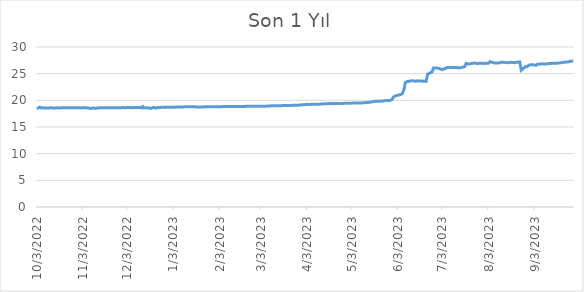
| Category | Series 0 |
|---|---|
| 10/3/22 | 18.486 |
| 10/3/22 | 18.522 |
| 10/4/22 | 18.556 |
| 10/4/22 | 18.536 |
| 10/5/22 | 18.738 |
| 10/5/22 | 18.557 |
| 10/6/22 | 18.568 |
| 10/6/22 | 18.58 |
| 10/7/22 | 18.592 |
| 10/10/22 | 18.566 |
| 10/10/22 | 18.549 |
| 10/11/22 | 18.578 |
| 10/11/22 | 18.58 |
| 10/12/22 | 18.601 |
| 10/12/22 | 18.505 |
| 10/13/22 | 18.597 |
| 10/13/22 | 18.529 |
| 10/14/22 | 18.568 |
| 10/17/22 | 18.591 |
| 10/17/22 | 18.607 |
| 10/18/22 | 18.568 |
| 10/18/22 | 18.582 |
| 10/19/22 | 18.585 |
| 10/19/22 | 18.574 |
| 10/20/22 | 18.595 |
| 10/20/22 | 18.579 |
| 10/21/22 | 18.594 |
| 10/24/22 | 18.594 |
| 10/24/22 | 18.549 |
| 10/25/22 | 18.618 |
| 10/25/22 | 18.59 |
| 10/26/22 | 18.616 |
| 10/26/22 | 18.604 |
| 10/27/22 | 18.602 |
| 10/27/22 | 18.586 |
| 10/28/22 | 18.6 |
| 10/31/22 | 18.612 |
| 10/31/22 | 18.601 |
| 11/1/22 | 18.609 |
| 11/1/22 | 18.555 |
| 11/2/22 | 18.572 |
| 11/2/22 | 18.584 |
| 11/3/22 | 18.623 |
| 11/3/22 | 18.593 |
| 11/4/22 | 18.617 |
| 11/7/22 | 18.568 |
| 11/7/22 | 18.437 |
| 11/8/22 | 18.451 |
| 11/8/22 | 18.519 |
| 11/9/22 | 18.534 |
| 11/9/22 | 18.568 |
| 11/10/22 | 18.583 |
| 11/10/22 | 18.459 |
| 11/11/22 | 18.491 |
| 11/14/22 | 18.592 |
| 11/14/22 | 18.585 |
| 11/15/22 | 18.592 |
| 11/15/22 | 18.588 |
| 11/16/22 | 18.619 |
| 11/16/22 | 18.592 |
| 11/17/22 | 18.62 |
| 11/17/22 | 18.544 |
| 11/18/22 | 18.586 |
| 11/21/22 | 18.627 |
| 11/21/22 | 18.607 |
| 11/22/22 | 18.615 |
| 11/22/22 | 18.608 |
| 11/23/22 | 18.621 |
| 11/23/22 | 18.606 |
| 11/24/22 | 18.618 |
| 11/24/22 | 18.58 |
| 11/25/22 | 18.609 |
| 11/28/22 | 18.602 |
| 11/28/22 | 18.6 |
| 11/29/22 | 18.618 |
| 11/29/22 | 18.657 |
| 11/30/22 | 18.656 |
| 11/30/22 | 18.61 |
| 12/1/22 | 18.596 |
| 12/1/22 | 18.628 |
| 12/2/22 | 18.634 |
| 12/5/22 | 18.65 |
| 12/5/22 | 18.635 |
| 12/6/22 | 18.627 |
| 12/6/22 | 18.617 |
| 12/7/22 | 18.629 |
| 12/7/22 | 18.62 |
| 12/8/22 | 18.647 |
| 12/8/22 | 18.611 |
| 12/9/22 | 18.641 |
| 12/12/22 | 18.65 |
| 12/12/22 | 18.624 |
| 12/13/22 | 18.792 |
| 12/13/22 | 18.597 |
| 12/14/22 | 18.62 |
| 12/14/22 | 18.595 |
| 12/15/22 | 18.63 |
| 12/15/22 | 18.626 |
| 12/16/22 | 18.627 |
| 12/19/22 | 18.478 |
| 12/19/22 | 18.635 |
| 12/20/22 | 18.656 |
| 12/20/22 | 18.648 |
| 12/21/22 | 18.65 |
| 12/21/22 | 18.622 |
| 12/22/22 | 18.505 |
| 12/22/22 | 18.642 |
| 12/23/22 | 18.644 |
| 12/26/22 | 18.683 |
| 12/26/22 | 18.66 |
| 12/27/22 | 18.695 |
| 12/27/22 | 18.667 |
| 12/28/22 | 18.669 |
| 12/28/22 | 18.701 |
| 12/29/22 | 18.732 |
| 12/29/22 | 18.703 |
| 12/30/22 | 18.696 |
| 1/2/23 | 18.696 |
| 1/2/23 | 18.694 |
| 1/3/23 | 18.73 |
| 1/3/23 | 18.715 |
| 1/4/23 | 18.714 |
| 1/4/23 | 18.722 |
| 1/5/23 | 18.744 |
| 1/5/23 | 18.718 |
| 1/6/23 | 18.762 |
| 1/9/23 | 18.74 |
| 1/9/23 | 18.765 |
| 1/10/23 | 18.773 |
| 1/10/23 | 18.764 |
| 1/11/23 | 18.778 |
| 1/11/23 | 18.781 |
| 1/12/23 | 18.785 |
| 1/12/23 | 18.759 |
| 1/13/23 | 18.79 |
| 1/16/23 | 18.802 |
| 1/16/23 | 18.777 |
| 1/17/23 | 18.828 |
| 1/17/23 | 18.744 |
| 1/18/23 | 18.75 |
| 1/18/23 | 18.757 |
| 1/19/23 | 18.759 |
| 1/19/23 | 18.751 |
| 1/20/23 | 18.762 |
| 1/23/23 | 18.764 |
| 1/23/23 | 18.803 |
| 1/24/23 | 18.806 |
| 1/24/23 | 18.81 |
| 1/25/23 | 18.819 |
| 1/25/23 | 18.79 |
| 1/26/23 | 18.8 |
| 1/26/23 | 18.774 |
| 1/27/23 | 18.799 |
| 1/30/23 | 18.814 |
| 1/30/23 | 18.772 |
| 1/31/23 | 18.793 |
| 1/31/23 | 18.778 |
| 2/1/23 | 18.815 |
| 2/1/23 | 18.796 |
| 2/2/23 | 18.816 |
| 2/2/23 | 18.803 |
| 2/3/23 | 18.794 |
| 2/6/23 | 18.828 |
| 2/6/23 | 18.766 |
| 2/7/23 | 18.828 |
| 2/7/23 | 18.815 |
| 2/8/23 | 18.825 |
| 2/8/23 | 18.824 |
| 2/9/23 | 18.833 |
| 2/9/23 | 18.82 |
| 2/10/23 | 18.832 |
| 2/13/23 | 18.821 |
| 2/13/23 | 18.82 |
| 2/14/23 | 18.842 |
| 2/14/23 | 18.829 |
| 2/15/23 | 18.85 |
| 2/15/23 | 18.853 |
| 2/16/23 | 18.845 |
| 2/16/23 | 18.846 |
| 2/17/23 | 18.848 |
| 2/20/23 | 18.856 |
| 2/20/23 | 18.856 |
| 2/21/23 | 18.883 |
| 2/22/23 | 18.866 |
| 2/23/23 | 18.88 |
| 2/24/23 | 18.885 |
| 2/27/23 | 18.887 |
| 2/28/23 | 18.889 |
| 3/1/23 | 18.887 |
| 3/2/23 | 18.888 |
| 3/3/23 | 18.895 |
| 3/6/23 | 18.902 |
| 3/7/23 | 18.922 |
| 3/8/23 | 18.926 |
| 3/9/23 | 18.948 |
| 3/10/23 | 18.97 |
| 3/13/23 | 18.975 |
| 3/14/23 | 18.974 |
| 3/15/23 | 18.979 |
| 3/16/23 | 18.992 |
| 3/17/23 | 19.009 |
| 3/20/23 | 19.018 |
| 3/21/23 | 19.018 |
| 3/22/23 | 19.029 |
| 3/23/23 | 19.05 |
| 3/24/23 | 19.061 |
| 3/27/23 | 19.085 |
| 3/28/23 | 19.096 |
| 3/29/23 | 19.125 |
| 3/30/23 | 19.152 |
| 3/31/23 | 19.188 |
| 4/3/23 | 19.199 |
| 4/4/23 | 19.212 |
| 4/5/23 | 19.225 |
| 4/6/23 | 19.254 |
| 4/7/23 | 19.258 |
| 4/10/23 | 19.258 |
| 4/11/23 | 19.269 |
| 4/12/23 | 19.304 |
| 4/13/23 | 19.321 |
| 4/14/23 | 19.335 |
| 4/17/23 | 19.377 |
| 4/18/23 | 19.392 |
| 4/19/23 | 19.4 |
| 4/20/23 | 19.404 |
| 4/21/23 | 19.407 |
| 4/24/23 | 19.407 |
| 4/25/23 | 19.408 |
| 4/26/23 | 19.428 |
| 4/27/23 | 19.428 |
| 4/28/23 | 19.44 |
| 5/1/23 | 19.453 |
| 5/2/23 | 19.462 |
| 5/3/23 | 19.479 |
| 5/4/23 | 19.479 |
| 5/5/23 | 19.487 |
| 5/8/23 | 19.502 |
| 5/9/23 | 19.506 |
| 5/10/23 | 19.526 |
| 5/11/23 | 19.545 |
| 5/12/23 | 19.572 |
| 5/15/23 | 19.634 |
| 5/16/23 | 19.683 |
| 5/17/23 | 19.736 |
| 5/18/23 | 19.776 |
| 5/19/23 | 19.815 |
| 5/22/23 | 19.822 |
| 5/23/23 | 19.865 |
| 5/24/23 | 19.868 |
| 5/25/23 | 19.911 |
| 5/26/23 | 19.979 |
| 5/29/23 | 19.994 |
| 5/30/23 | 20.149 |
| 5/31/23 | 20.624 |
| 6/1/23 | 20.759 |
| 6/2/23 | 20.896 |
| 6/5/23 | 21.086 |
| 6/6/23 | 21.273 |
| 6/7/23 | 21.946 |
| 6/8/23 | 23.3 |
| 6/9/23 | 23.504 |
| 6/12/23 | 23.65 |
| 6/13/23 | 23.666 |
| 6/14/23 | 23.641 |
| 6/15/23 | 23.562 |
| 6/16/23 | 23.655 |
| 6/19/23 | 23.626 |
| 6/20/23 | 23.584 |
| 6/21/23 | 23.584 |
| 6/22/23 | 23.558 |
| 6/23/23 | 24.906 |
| 6/26/23 | 25.324 |
| 6/27/23 | 26.077 |
| 6/28/23 | 26.069 |
| 6/29/23 | 26.05 |
| 6/30/23 | 26.036 |
| 7/3/23 | 25.746 |
| 7/4/23 | 25.922 |
| 7/5/23 | 25.964 |
| 7/6/23 | 26.164 |
| 7/7/23 | 26.135 |
| 7/10/23 | 26.142 |
| 7/11/23 | 26.203 |
| 7/12/23 | 26.112 |
| 7/13/23 | 26.15 |
| 7/14/23 | 26.072 |
| 7/17/23 | 26.223 |
| 7/18/23 | 26.365 |
| 7/19/23 | 26.938 |
| 7/20/23 | 26.832 |
| 7/21/23 | 26.833 |
| 7/24/23 | 26.973 |
| 7/25/23 | 26.981 |
| 7/26/23 | 26.93 |
| 7/27/23 | 26.912 |
| 7/28/23 | 26.96 |
| 7/31/23 | 26.923 |
| 8/1/23 | 26.939 |
| 8/2/23 | 26.976 |
| 8/3/23 | 26.966 |
| 8/4/23 | 27.252 |
| 8/7/23 | 27.004 |
| 8/8/23 | 27.01 |
| 8/9/23 | 26.996 |
| 8/10/23 | 26.995 |
| 8/11/23 | 27.123 |
| 8/14/23 | 27.116 |
| 8/15/23 | 27.061 |
| 8/16/23 | 27.065 |
| 8/17/23 | 27.083 |
| 8/18/23 | 27.13 |
| 8/21/23 | 27.054 |
| 8/22/23 | 27.156 |
| 8/23/23 | 27.197 |
| 8/24/23 | 27.187 |
| 8/25/23 | 25.653 |
| 8/28/23 | 26.357 |
| 8/29/23 | 26.317 |
| 8/30/23 | 26.558 |
| 8/31/23 | 26.683 |
| 9/1/23 | 26.694 |
| 9/4/23 | 26.584 |
| 9/5/23 | 26.777 |
| 9/6/23 | 26.776 |
| 9/7/23 | 26.826 |
| 9/8/23 | 26.841 |
| 9/11/23 | 26.803 |
| 9/12/23 | 26.884 |
| 9/13/23 | 26.923 |
| 9/14/23 | 26.89 |
| 9/15/23 | 26.949 |
| 9/18/23 | 26.942 |
| 9/19/23 | 26.991 |
| 9/20/23 | 27.027 |
| 9/21/23 | 27.049 |
| 9/22/23 | 27.119 |
| 9/25/23 | 27.194 |
| 9/26/23 | 27.222 |
| 9/27/23 | 27.348 |
| 9/28/23 | 27.34 |
| 9/29/23 | 27.463 |